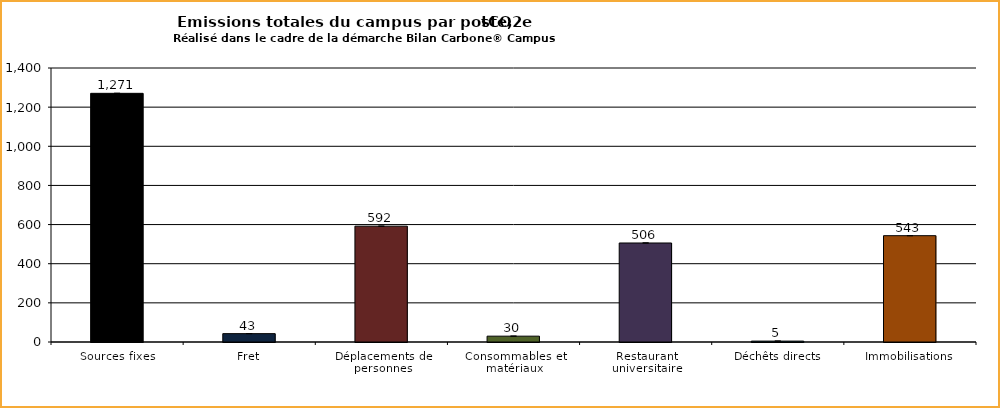
| Category | Series 0 |
|---|---|
| Sources fixes | 1270.553 |
| Fret | 42.72 |
| Déplacements de personnes | 591.853 |
| Consommables et matériaux | 29.799 |
| Restaurant universitaire | 505.849 |
| Déchêts directs | 4.626 |
| Immobilisations | 543.238 |